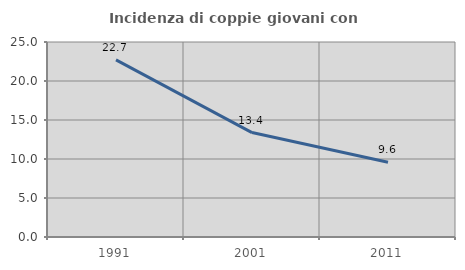
| Category | Incidenza di coppie giovani con figli |
|---|---|
| 1991.0 | 22.712 |
| 2001.0 | 13.387 |
| 2011.0 | 9.578 |